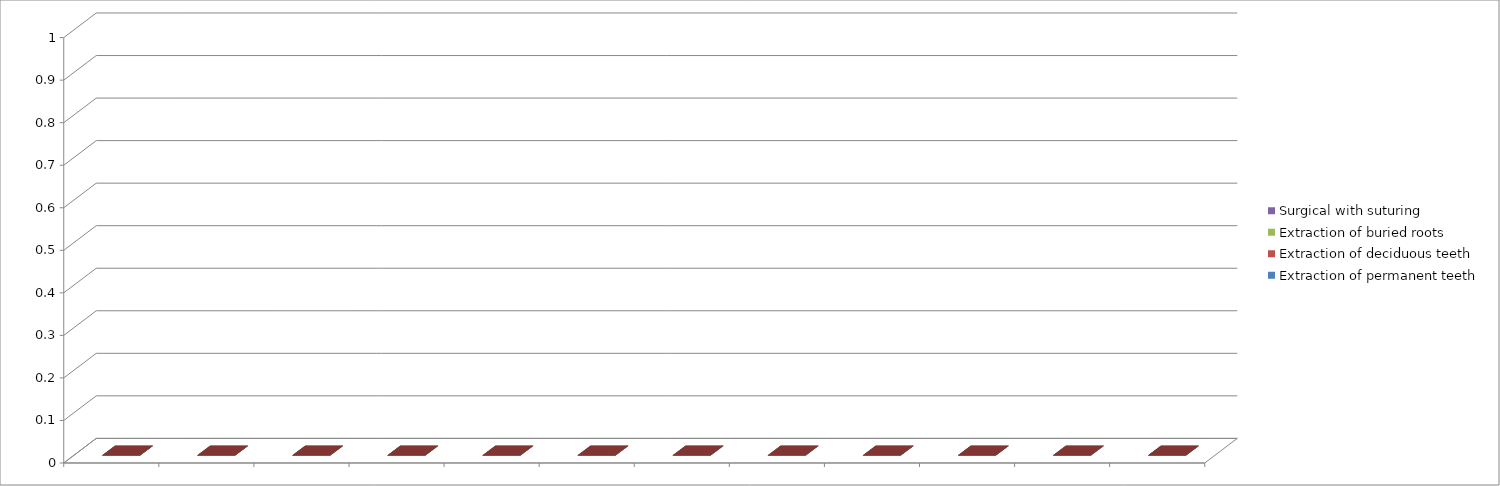
| Category | Extraction of permanent teeth | Extraction of deciduous teeth | Extraction of buried roots | Surgical with suturing |
|---|---|---|---|---|
| 0 | 0 | 0 | 0 | 0 |
| 1 | 0 | 0 | 0 | 0 |
| 2 | 0 | 0 | 0 | 0 |
| 3 | 0 | 0 | 0 | 0 |
| 4 | 0 | 0 | 0 | 0 |
| 5 | 0 | 0 | 0 | 0 |
| 6 | 0 | 0 | 0 | 0 |
| 7 | 0 | 0 | 0 | 0 |
| 8 | 0 | 0 | 0 | 0 |
| 9 | 0 | 0 | 0 | 0 |
| 10 | 0 | 0 | 0 | 0 |
| 11 | 0 | 0 | 0 | 0 |